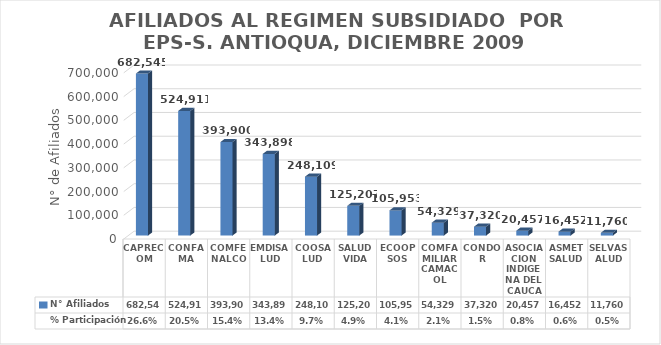
| Category | N° Afiliados | % Participación |
|---|---|---|
| CAPRECOM | 682545 | 0.266 |
| CONFAMA | 524911 | 0.205 |
| COMFENALCO | 393900 | 0.154 |
| EMDISALUD | 343898 | 0.134 |
| COOSALUD | 248109 | 0.097 |
| SALUDVIDA | 125207 | 0.049 |
| ECOOPSOS | 105953 | 0.041 |
| COMFAMILIAR CAMACOL | 54329 | 0.021 |
| CONDOR | 37320 | 0.015 |
| ASOCIACION INDIGENA DEL CAUCA | 20457 | 0.008 |
| ASMETSALUD | 16452 | 0.006 |
| SELVASALUD | 11760 | 0.005 |